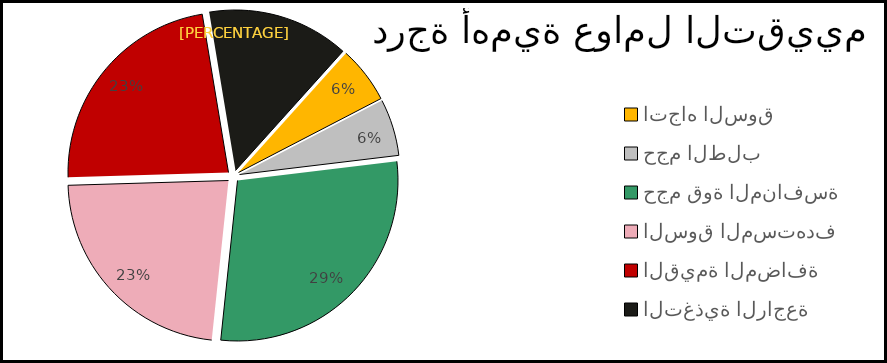
| Category | Series 7 |
|---|---|
| اتجاه السوق | 2 |
| حجم الطلب | 2 |
| حجم قوة المنافسة | 10 |
| السوق المستهدف | 8 |
| القيمة المضافة | 8 |
| التغذية الراجعة | 5 |